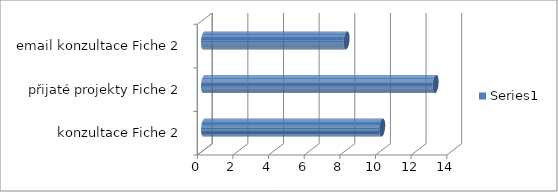
| Category | Series 0 |
|---|---|
|  konzultace Fiche 2 | 10 |
| přijaté projekty Fiche 2 | 13 |
| email konzultace Fiche 2 | 8 |